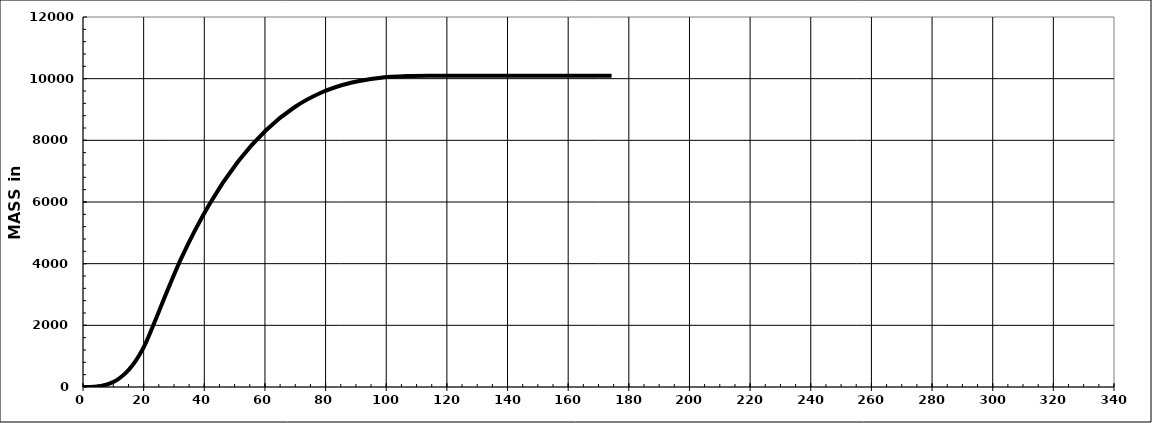
| Category | Series 0 |
|---|---|
| 0.00016666666666666666 | 0 |
| 2.3245334713960935 | 3.014 |
| 4.64890027612552 | 18.085 |
| 6.9732670808549475 | 57.268 |
| 9.297633885584373 | 132.617 |
| 11.6220006903138 | 256.19 |
| 13.946367495043228 | 440.041 |
| 16.270734299772656 | 696.226 |
| 18.59510110450208 | 1036.801 |
| 20.91946790923151 | 1473.82 |
| 23.243834713960936 | 2019.339 |
| 23.243837899010217 | 2019.34 |
| 23.2438410840595 | 2019.341 |
| 23.24384426910878 | 2019.342 |
| 23.243847454158065 | 2019.343 |
| 23.243850639207345 | 2019.344 |
| 23.24385382425663 | 2019.344 |
| 23.24385700930591 | 2019.345 |
| 23.243860194355193 | 2019.346 |
| 23.243863379404477 | 2019.347 |
| 23.243866564453757 | 2019.348 |
| 32.54133378337146 | 4201.426 |
| 41.83880100228917 | 5949.503 |
| 51.13626822120688 | 7311.8 |
| 60.433735440124586 | 8336.54 |
| 69.7312026590423 | 9071.945 |
| 79.02866987796 | 9566.236 |
| 88.3261370968777 | 9867.636 |
| 97.62360431579539 | 10024.366 |
| 106.92107153471309 | 10084.648 |
| 116.2185387536308 | 10096.706 |
| 145.27317344203848 | 10096.706 |
| 174.3278081304462 | 10096.706 |